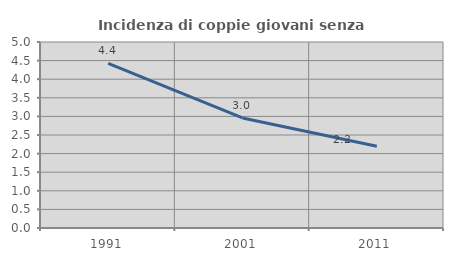
| Category | Incidenza di coppie giovani senza figli |
|---|---|
| 1991.0 | 4.423 |
| 2001.0 | 2.959 |
| 2011.0 | 2.2 |